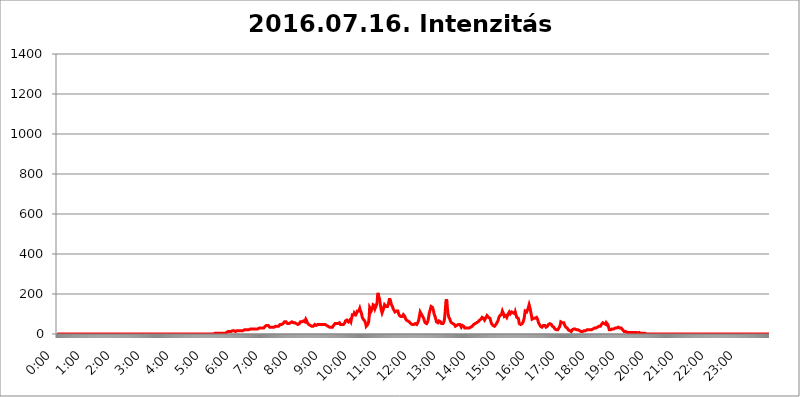
| Category | 2016.07.16. Intenzitás [W/m^2] |
|---|---|
| 0.0 | 0 |
| 0.0006944444444444445 | 0 |
| 0.001388888888888889 | 0 |
| 0.0020833333333333333 | 0 |
| 0.002777777777777778 | 0 |
| 0.003472222222222222 | 0 |
| 0.004166666666666667 | 0 |
| 0.004861111111111111 | 0 |
| 0.005555555555555556 | 0 |
| 0.0062499999999999995 | 0 |
| 0.006944444444444444 | 0 |
| 0.007638888888888889 | 0 |
| 0.008333333333333333 | 0 |
| 0.009027777777777779 | 0 |
| 0.009722222222222222 | 0 |
| 0.010416666666666666 | 0 |
| 0.011111111111111112 | 0 |
| 0.011805555555555555 | 0 |
| 0.012499999999999999 | 0 |
| 0.013194444444444444 | 0 |
| 0.013888888888888888 | 0 |
| 0.014583333333333332 | 0 |
| 0.015277777777777777 | 0 |
| 0.015972222222222224 | 0 |
| 0.016666666666666666 | 0 |
| 0.017361111111111112 | 0 |
| 0.018055555555555557 | 0 |
| 0.01875 | 0 |
| 0.019444444444444445 | 0 |
| 0.02013888888888889 | 0 |
| 0.020833333333333332 | 0 |
| 0.02152777777777778 | 0 |
| 0.022222222222222223 | 0 |
| 0.02291666666666667 | 0 |
| 0.02361111111111111 | 0 |
| 0.024305555555555556 | 0 |
| 0.024999999999999998 | 0 |
| 0.025694444444444447 | 0 |
| 0.02638888888888889 | 0 |
| 0.027083333333333334 | 0 |
| 0.027777777777777776 | 0 |
| 0.02847222222222222 | 0 |
| 0.029166666666666664 | 0 |
| 0.029861111111111113 | 0 |
| 0.030555555555555555 | 0 |
| 0.03125 | 0 |
| 0.03194444444444445 | 0 |
| 0.03263888888888889 | 0 |
| 0.03333333333333333 | 0 |
| 0.034027777777777775 | 0 |
| 0.034722222222222224 | 0 |
| 0.035416666666666666 | 0 |
| 0.036111111111111115 | 0 |
| 0.03680555555555556 | 0 |
| 0.0375 | 0 |
| 0.03819444444444444 | 0 |
| 0.03888888888888889 | 0 |
| 0.03958333333333333 | 0 |
| 0.04027777777777778 | 0 |
| 0.04097222222222222 | 0 |
| 0.041666666666666664 | 0 |
| 0.042361111111111106 | 0 |
| 0.04305555555555556 | 0 |
| 0.043750000000000004 | 0 |
| 0.044444444444444446 | 0 |
| 0.04513888888888889 | 0 |
| 0.04583333333333334 | 0 |
| 0.04652777777777778 | 0 |
| 0.04722222222222222 | 0 |
| 0.04791666666666666 | 0 |
| 0.04861111111111111 | 0 |
| 0.049305555555555554 | 0 |
| 0.049999999999999996 | 0 |
| 0.05069444444444445 | 0 |
| 0.051388888888888894 | 0 |
| 0.052083333333333336 | 0 |
| 0.05277777777777778 | 0 |
| 0.05347222222222222 | 0 |
| 0.05416666666666667 | 0 |
| 0.05486111111111111 | 0 |
| 0.05555555555555555 | 0 |
| 0.05625 | 0 |
| 0.05694444444444444 | 0 |
| 0.057638888888888885 | 0 |
| 0.05833333333333333 | 0 |
| 0.05902777777777778 | 0 |
| 0.059722222222222225 | 0 |
| 0.06041666666666667 | 0 |
| 0.061111111111111116 | 0 |
| 0.06180555555555556 | 0 |
| 0.0625 | 0 |
| 0.06319444444444444 | 0 |
| 0.06388888888888888 | 0 |
| 0.06458333333333334 | 0 |
| 0.06527777777777778 | 0 |
| 0.06597222222222222 | 0 |
| 0.06666666666666667 | 0 |
| 0.06736111111111111 | 0 |
| 0.06805555555555555 | 0 |
| 0.06874999999999999 | 0 |
| 0.06944444444444443 | 0 |
| 0.07013888888888889 | 0 |
| 0.07083333333333333 | 0 |
| 0.07152777777777779 | 0 |
| 0.07222222222222223 | 0 |
| 0.07291666666666667 | 0 |
| 0.07361111111111111 | 0 |
| 0.07430555555555556 | 0 |
| 0.075 | 0 |
| 0.07569444444444444 | 0 |
| 0.0763888888888889 | 0 |
| 0.07708333333333334 | 0 |
| 0.07777777777777778 | 0 |
| 0.07847222222222222 | 0 |
| 0.07916666666666666 | 0 |
| 0.0798611111111111 | 0 |
| 0.08055555555555556 | 0 |
| 0.08125 | 0 |
| 0.08194444444444444 | 0 |
| 0.08263888888888889 | 0 |
| 0.08333333333333333 | 0 |
| 0.08402777777777777 | 0 |
| 0.08472222222222221 | 0 |
| 0.08541666666666665 | 0 |
| 0.08611111111111112 | 0 |
| 0.08680555555555557 | 0 |
| 0.08750000000000001 | 0 |
| 0.08819444444444445 | 0 |
| 0.08888888888888889 | 0 |
| 0.08958333333333333 | 0 |
| 0.09027777777777778 | 0 |
| 0.09097222222222222 | 0 |
| 0.09166666666666667 | 0 |
| 0.09236111111111112 | 0 |
| 0.09305555555555556 | 0 |
| 0.09375 | 0 |
| 0.09444444444444444 | 0 |
| 0.09513888888888888 | 0 |
| 0.09583333333333333 | 0 |
| 0.09652777777777777 | 0 |
| 0.09722222222222222 | 0 |
| 0.09791666666666667 | 0 |
| 0.09861111111111111 | 0 |
| 0.09930555555555555 | 0 |
| 0.09999999999999999 | 0 |
| 0.10069444444444443 | 0 |
| 0.1013888888888889 | 0 |
| 0.10208333333333335 | 0 |
| 0.10277777777777779 | 0 |
| 0.10347222222222223 | 0 |
| 0.10416666666666667 | 0 |
| 0.10486111111111111 | 0 |
| 0.10555555555555556 | 0 |
| 0.10625 | 0 |
| 0.10694444444444444 | 0 |
| 0.1076388888888889 | 0 |
| 0.10833333333333334 | 0 |
| 0.10902777777777778 | 0 |
| 0.10972222222222222 | 0 |
| 0.1111111111111111 | 0 |
| 0.11180555555555556 | 0 |
| 0.11180555555555556 | 0 |
| 0.1125 | 0 |
| 0.11319444444444444 | 0 |
| 0.11388888888888889 | 0 |
| 0.11458333333333333 | 0 |
| 0.11527777777777777 | 0 |
| 0.11597222222222221 | 0 |
| 0.11666666666666665 | 0 |
| 0.1173611111111111 | 0 |
| 0.11805555555555557 | 0 |
| 0.11944444444444445 | 0 |
| 0.12013888888888889 | 0 |
| 0.12083333333333333 | 0 |
| 0.12152777777777778 | 0 |
| 0.12222222222222223 | 0 |
| 0.12291666666666667 | 0 |
| 0.12291666666666667 | 0 |
| 0.12361111111111112 | 0 |
| 0.12430555555555556 | 0 |
| 0.125 | 0 |
| 0.12569444444444444 | 0 |
| 0.12638888888888888 | 0 |
| 0.12708333333333333 | 0 |
| 0.16875 | 0 |
| 0.12847222222222224 | 0 |
| 0.12916666666666668 | 0 |
| 0.12986111111111112 | 0 |
| 0.13055555555555556 | 0 |
| 0.13125 | 0 |
| 0.13194444444444445 | 0 |
| 0.1326388888888889 | 0 |
| 0.13333333333333333 | 0 |
| 0.13402777777777777 | 0 |
| 0.13402777777777777 | 0 |
| 0.13472222222222222 | 0 |
| 0.13541666666666666 | 0 |
| 0.1361111111111111 | 0 |
| 0.13749999999999998 | 0 |
| 0.13819444444444443 | 0 |
| 0.1388888888888889 | 0 |
| 0.13958333333333334 | 0 |
| 0.14027777777777778 | 0 |
| 0.14097222222222222 | 0 |
| 0.14166666666666666 | 0 |
| 0.1423611111111111 | 0 |
| 0.14305555555555557 | 0 |
| 0.14375000000000002 | 0 |
| 0.14444444444444446 | 0 |
| 0.1451388888888889 | 0 |
| 0.1451388888888889 | 0 |
| 0.14652777777777778 | 0 |
| 0.14722222222222223 | 0 |
| 0.14791666666666667 | 0 |
| 0.1486111111111111 | 0 |
| 0.14930555555555555 | 0 |
| 0.15 | 0 |
| 0.15069444444444444 | 0 |
| 0.15138888888888888 | 0 |
| 0.15208333333333332 | 0 |
| 0.15277777777777776 | 0 |
| 0.15347222222222223 | 0 |
| 0.15416666666666667 | 0 |
| 0.15486111111111112 | 0 |
| 0.15555555555555556 | 0 |
| 0.15625 | 0 |
| 0.15694444444444444 | 0 |
| 0.15763888888888888 | 0 |
| 0.15833333333333333 | 0 |
| 0.15902777777777777 | 0 |
| 0.15972222222222224 | 0 |
| 0.16041666666666668 | 0 |
| 0.16111111111111112 | 0 |
| 0.16180555555555556 | 0 |
| 0.1625 | 0 |
| 0.16319444444444445 | 0 |
| 0.1638888888888889 | 0 |
| 0.16458333333333333 | 0 |
| 0.16527777777777777 | 0 |
| 0.16597222222222222 | 0 |
| 0.16666666666666666 | 0 |
| 0.1673611111111111 | 0 |
| 0.16805555555555554 | 0 |
| 0.16874999999999998 | 0 |
| 0.16944444444444443 | 0 |
| 0.17013888888888887 | 0 |
| 0.1708333333333333 | 0 |
| 0.17152777777777775 | 0 |
| 0.17222222222222225 | 0 |
| 0.1729166666666667 | 0 |
| 0.17361111111111113 | 0 |
| 0.17430555555555557 | 0 |
| 0.17500000000000002 | 0 |
| 0.17569444444444446 | 0 |
| 0.1763888888888889 | 0 |
| 0.17708333333333334 | 0 |
| 0.17777777777777778 | 0 |
| 0.17847222222222223 | 0 |
| 0.17916666666666667 | 0 |
| 0.1798611111111111 | 0 |
| 0.18055555555555555 | 0 |
| 0.18125 | 0 |
| 0.18194444444444444 | 0 |
| 0.1826388888888889 | 0 |
| 0.18333333333333335 | 0 |
| 0.1840277777777778 | 0 |
| 0.18472222222222223 | 0 |
| 0.18541666666666667 | 0 |
| 0.18611111111111112 | 0 |
| 0.18680555555555556 | 0 |
| 0.1875 | 0 |
| 0.18819444444444444 | 0 |
| 0.18888888888888888 | 0 |
| 0.18958333333333333 | 0 |
| 0.19027777777777777 | 0 |
| 0.1909722222222222 | 0 |
| 0.19166666666666665 | 0 |
| 0.19236111111111112 | 0 |
| 0.19305555555555554 | 0 |
| 0.19375 | 0 |
| 0.19444444444444445 | 0 |
| 0.1951388888888889 | 0 |
| 0.19583333333333333 | 0 |
| 0.19652777777777777 | 0 |
| 0.19722222222222222 | 0 |
| 0.19791666666666666 | 0 |
| 0.1986111111111111 | 0 |
| 0.19930555555555554 | 0 |
| 0.19999999999999998 | 0 |
| 0.20069444444444443 | 0 |
| 0.20138888888888887 | 0 |
| 0.2020833333333333 | 0 |
| 0.2027777777777778 | 0 |
| 0.2034722222222222 | 0 |
| 0.2041666666666667 | 0 |
| 0.20486111111111113 | 0 |
| 0.20555555555555557 | 0 |
| 0.20625000000000002 | 0 |
| 0.20694444444444446 | 0 |
| 0.2076388888888889 | 0 |
| 0.20833333333333334 | 0 |
| 0.20902777777777778 | 0 |
| 0.20972222222222223 | 0 |
| 0.21041666666666667 | 0 |
| 0.2111111111111111 | 0 |
| 0.21180555555555555 | 0 |
| 0.2125 | 0 |
| 0.21319444444444444 | 0 |
| 0.2138888888888889 | 0 |
| 0.21458333333333335 | 0 |
| 0.2152777777777778 | 0 |
| 0.21597222222222223 | 0 |
| 0.21666666666666667 | 0 |
| 0.21736111111111112 | 0 |
| 0.21805555555555556 | 0 |
| 0.21875 | 0 |
| 0.21944444444444444 | 3.525 |
| 0.22013888888888888 | 0 |
| 0.22083333333333333 | 3.525 |
| 0.22152777777777777 | 3.525 |
| 0.2222222222222222 | 3.525 |
| 0.22291666666666665 | 3.525 |
| 0.2236111111111111 | 3.525 |
| 0.22430555555555556 | 3.525 |
| 0.225 | 3.525 |
| 0.22569444444444445 | 3.525 |
| 0.2263888888888889 | 3.525 |
| 0.22708333333333333 | 3.525 |
| 0.22777777777777777 | 3.525 |
| 0.22847222222222222 | 3.525 |
| 0.22916666666666666 | 3.525 |
| 0.2298611111111111 | 3.525 |
| 0.23055555555555554 | 3.525 |
| 0.23124999999999998 | 3.525 |
| 0.23194444444444443 | 3.525 |
| 0.23263888888888887 | 3.525 |
| 0.2333333333333333 | 3.525 |
| 0.2340277777777778 | 3.525 |
| 0.2347222222222222 | 3.525 |
| 0.2354166666666667 | 3.525 |
| 0.23611111111111113 | 3.525 |
| 0.23680555555555557 | 7.887 |
| 0.23750000000000002 | 7.887 |
| 0.23819444444444446 | 7.887 |
| 0.2388888888888889 | 7.887 |
| 0.23958333333333334 | 12.257 |
| 0.24027777777777778 | 12.257 |
| 0.24097222222222223 | 12.257 |
| 0.24166666666666667 | 12.257 |
| 0.2423611111111111 | 12.257 |
| 0.24305555555555555 | 12.257 |
| 0.24375 | 12.257 |
| 0.24444444444444446 | 12.257 |
| 0.24513888888888888 | 12.257 |
| 0.24583333333333335 | 16.636 |
| 0.2465277777777778 | 16.636 |
| 0.24722222222222223 | 16.636 |
| 0.24791666666666667 | 16.636 |
| 0.24861111111111112 | 16.636 |
| 0.24930555555555556 | 16.636 |
| 0.25 | 12.257 |
| 0.25069444444444444 | 16.636 |
| 0.2513888888888889 | 12.257 |
| 0.2520833333333333 | 16.636 |
| 0.25277777777777777 | 12.257 |
| 0.2534722222222222 | 12.257 |
| 0.25416666666666665 | 16.636 |
| 0.2548611111111111 | 16.636 |
| 0.2555555555555556 | 16.636 |
| 0.25625000000000003 | 16.636 |
| 0.2569444444444445 | 16.636 |
| 0.2576388888888889 | 16.636 |
| 0.25833333333333336 | 16.636 |
| 0.2590277777777778 | 16.636 |
| 0.25972222222222224 | 16.636 |
| 0.2604166666666667 | 16.636 |
| 0.2611111111111111 | 21.024 |
| 0.26180555555555557 | 21.024 |
| 0.2625 | 21.024 |
| 0.26319444444444445 | 21.024 |
| 0.2638888888888889 | 21.024 |
| 0.26458333333333334 | 21.024 |
| 0.2652777777777778 | 21.024 |
| 0.2659722222222222 | 21.024 |
| 0.26666666666666666 | 21.024 |
| 0.2673611111111111 | 21.024 |
| 0.26805555555555555 | 21.024 |
| 0.26875 | 21.024 |
| 0.26944444444444443 | 25.419 |
| 0.2701388888888889 | 25.419 |
| 0.2708333333333333 | 25.419 |
| 0.27152777777777776 | 25.419 |
| 0.2722222222222222 | 25.419 |
| 0.27291666666666664 | 25.419 |
| 0.2736111111111111 | 25.419 |
| 0.2743055555555555 | 25.419 |
| 0.27499999999999997 | 25.419 |
| 0.27569444444444446 | 29.823 |
| 0.27638888888888885 | 29.823 |
| 0.27708333333333335 | 25.419 |
| 0.2777777777777778 | 29.823 |
| 0.27847222222222223 | 25.419 |
| 0.2791666666666667 | 25.419 |
| 0.2798611111111111 | 25.419 |
| 0.28055555555555556 | 25.419 |
| 0.28125 | 25.419 |
| 0.28194444444444444 | 29.823 |
| 0.2826388888888889 | 29.823 |
| 0.2833333333333333 | 29.823 |
| 0.28402777777777777 | 29.823 |
| 0.2847222222222222 | 29.823 |
| 0.28541666666666665 | 29.823 |
| 0.28611111111111115 | 29.823 |
| 0.28680555555555554 | 29.823 |
| 0.28750000000000003 | 29.823 |
| 0.2881944444444445 | 29.823 |
| 0.2888888888888889 | 29.823 |
| 0.28958333333333336 | 29.823 |
| 0.2902777777777778 | 29.823 |
| 0.29097222222222224 | 29.823 |
| 0.2916666666666667 | 38.653 |
| 0.2923611111111111 | 38.653 |
| 0.29305555555555557 | 43.079 |
| 0.29375 | 43.079 |
| 0.29444444444444445 | 43.079 |
| 0.2951388888888889 | 43.079 |
| 0.29583333333333334 | 43.079 |
| 0.2965277777777778 | 38.653 |
| 0.2972222222222222 | 38.653 |
| 0.29791666666666666 | 34.234 |
| 0.2986111111111111 | 29.823 |
| 0.29930555555555555 | 29.823 |
| 0.3 | 34.234 |
| 0.30069444444444443 | 34.234 |
| 0.3013888888888889 | 34.234 |
| 0.3020833333333333 | 34.234 |
| 0.30277777777777776 | 38.653 |
| 0.3034722222222222 | 38.653 |
| 0.30416666666666664 | 34.234 |
| 0.3048611111111111 | 34.234 |
| 0.3055555555555555 | 38.653 |
| 0.30624999999999997 | 38.653 |
| 0.3069444444444444 | 38.653 |
| 0.3076388888888889 | 38.653 |
| 0.30833333333333335 | 38.653 |
| 0.3090277777777778 | 38.653 |
| 0.30972222222222223 | 38.653 |
| 0.3104166666666667 | 38.653 |
| 0.3111111111111111 | 43.079 |
| 0.31180555555555556 | 43.079 |
| 0.3125 | 47.511 |
| 0.31319444444444444 | 47.511 |
| 0.3138888888888889 | 47.511 |
| 0.3145833333333333 | 47.511 |
| 0.31527777777777777 | 51.951 |
| 0.3159722222222222 | 51.951 |
| 0.31666666666666665 | 51.951 |
| 0.31736111111111115 | 51.951 |
| 0.31805555555555554 | 56.398 |
| 0.31875000000000003 | 60.85 |
| 0.3194444444444445 | 60.85 |
| 0.3201388888888889 | 60.85 |
| 0.32083333333333336 | 60.85 |
| 0.3215277777777778 | 56.398 |
| 0.32222222222222224 | 56.398 |
| 0.3229166666666667 | 51.951 |
| 0.3236111111111111 | 51.951 |
| 0.32430555555555557 | 51.951 |
| 0.325 | 51.951 |
| 0.32569444444444445 | 51.951 |
| 0.3263888888888889 | 56.398 |
| 0.32708333333333334 | 56.398 |
| 0.3277777777777778 | 56.398 |
| 0.3284722222222222 | 56.398 |
| 0.32916666666666666 | 60.85 |
| 0.3298611111111111 | 56.398 |
| 0.33055555555555555 | 60.85 |
| 0.33125 | 56.398 |
| 0.33194444444444443 | 56.398 |
| 0.3326388888888889 | 56.398 |
| 0.3333333333333333 | 56.398 |
| 0.3340277777777778 | 56.398 |
| 0.3347222222222222 | 56.398 |
| 0.3354166666666667 | 51.951 |
| 0.3361111111111111 | 51.951 |
| 0.3368055555555556 | 47.511 |
| 0.33749999999999997 | 47.511 |
| 0.33819444444444446 | 47.511 |
| 0.33888888888888885 | 51.951 |
| 0.33958333333333335 | 51.951 |
| 0.34027777777777773 | 56.398 |
| 0.34097222222222223 | 60.85 |
| 0.3416666666666666 | 56.398 |
| 0.3423611111111111 | 56.398 |
| 0.3430555555555555 | 60.85 |
| 0.34375 | 65.31 |
| 0.3444444444444445 | 65.31 |
| 0.3451388888888889 | 65.31 |
| 0.3458333333333334 | 65.31 |
| 0.34652777777777777 | 65.31 |
| 0.34722222222222227 | 60.85 |
| 0.34791666666666665 | 65.31 |
| 0.34861111111111115 | 74.246 |
| 0.34930555555555554 | 74.246 |
| 0.35000000000000003 | 65.31 |
| 0.3506944444444444 | 56.398 |
| 0.3513888888888889 | 51.951 |
| 0.3520833333333333 | 51.951 |
| 0.3527777777777778 | 47.511 |
| 0.3534722222222222 | 43.079 |
| 0.3541666666666667 | 43.079 |
| 0.3548611111111111 | 43.079 |
| 0.35555555555555557 | 38.653 |
| 0.35625 | 38.653 |
| 0.35694444444444445 | 38.653 |
| 0.3576388888888889 | 38.653 |
| 0.35833333333333334 | 38.653 |
| 0.3590277777777778 | 38.653 |
| 0.3597222222222222 | 38.653 |
| 0.36041666666666666 | 43.079 |
| 0.3611111111111111 | 47.511 |
| 0.36180555555555555 | 47.511 |
| 0.3625 | 43.079 |
| 0.36319444444444443 | 43.079 |
| 0.3638888888888889 | 43.079 |
| 0.3645833333333333 | 43.079 |
| 0.3652777777777778 | 47.511 |
| 0.3659722222222222 | 47.511 |
| 0.3666666666666667 | 47.511 |
| 0.3673611111111111 | 47.511 |
| 0.3680555555555556 | 47.511 |
| 0.36874999999999997 | 43.079 |
| 0.36944444444444446 | 47.511 |
| 0.37013888888888885 | 47.511 |
| 0.37083333333333335 | 47.511 |
| 0.37152777777777773 | 47.511 |
| 0.37222222222222223 | 51.951 |
| 0.3729166666666666 | 47.511 |
| 0.3736111111111111 | 47.511 |
| 0.3743055555555555 | 47.511 |
| 0.375 | 47.511 |
| 0.3756944444444445 | 47.511 |
| 0.3763888888888889 | 43.079 |
| 0.3770833333333334 | 43.079 |
| 0.37777777777777777 | 43.079 |
| 0.37847222222222227 | 43.079 |
| 0.37916666666666665 | 38.653 |
| 0.37986111111111115 | 38.653 |
| 0.38055555555555554 | 38.653 |
| 0.38125000000000003 | 38.653 |
| 0.3819444444444444 | 34.234 |
| 0.3826388888888889 | 29.823 |
| 0.3833333333333333 | 29.823 |
| 0.3840277777777778 | 34.234 |
| 0.3847222222222222 | 38.653 |
| 0.3854166666666667 | 34.234 |
| 0.3861111111111111 | 34.234 |
| 0.38680555555555557 | 38.653 |
| 0.3875 | 43.079 |
| 0.38819444444444445 | 47.511 |
| 0.3888888888888889 | 47.511 |
| 0.38958333333333334 | 51.951 |
| 0.3902777777777778 | 56.398 |
| 0.3909722222222222 | 56.398 |
| 0.39166666666666666 | 51.951 |
| 0.3923611111111111 | 51.951 |
| 0.39305555555555555 | 51.951 |
| 0.39375 | 51.951 |
| 0.39444444444444443 | 51.951 |
| 0.3951388888888889 | 56.398 |
| 0.3958333333333333 | 56.398 |
| 0.3965277777777778 | 51.951 |
| 0.3972222222222222 | 47.511 |
| 0.3979166666666667 | 51.951 |
| 0.3986111111111111 | 51.951 |
| 0.3993055555555556 | 47.511 |
| 0.39999999999999997 | 47.511 |
| 0.40069444444444446 | 47.511 |
| 0.40138888888888885 | 47.511 |
| 0.40208333333333335 | 47.511 |
| 0.40277777777777773 | 51.951 |
| 0.40347222222222223 | 56.398 |
| 0.4041666666666666 | 65.31 |
| 0.4048611111111111 | 69.775 |
| 0.4055555555555555 | 65.31 |
| 0.40625 | 69.775 |
| 0.4069444444444445 | 65.31 |
| 0.4076388888888889 | 65.31 |
| 0.4083333333333334 | 60.85 |
| 0.40902777777777777 | 65.31 |
| 0.40972222222222227 | 65.31 |
| 0.41041666666666665 | 69.775 |
| 0.41111111111111115 | 65.31 |
| 0.41180555555555554 | 60.85 |
| 0.41250000000000003 | 74.246 |
| 0.4131944444444444 | 83.205 |
| 0.4138888888888889 | 96.682 |
| 0.4145833333333333 | 101.184 |
| 0.4152777777777778 | 96.682 |
| 0.4159722222222222 | 96.682 |
| 0.4166666666666667 | 105.69 |
| 0.4173611111111111 | 110.201 |
| 0.41805555555555557 | 101.184 |
| 0.41875 | 96.682 |
| 0.41944444444444445 | 101.184 |
| 0.4201388888888889 | 105.69 |
| 0.42083333333333334 | 114.716 |
| 0.4215277777777778 | 110.201 |
| 0.4222222222222222 | 110.201 |
| 0.42291666666666666 | 114.716 |
| 0.4236111111111111 | 119.235 |
| 0.42430555555555555 | 128.284 |
| 0.425 | 119.235 |
| 0.42569444444444443 | 114.716 |
| 0.4263888888888889 | 105.69 |
| 0.4270833333333333 | 96.682 |
| 0.4277777777777778 | 83.205 |
| 0.4284722222222222 | 83.205 |
| 0.4291666666666667 | 74.246 |
| 0.4298611111111111 | 74.246 |
| 0.4305555555555556 | 74.246 |
| 0.43124999999999997 | 65.31 |
| 0.43194444444444446 | 60.85 |
| 0.43263888888888885 | 51.951 |
| 0.43333333333333335 | 38.653 |
| 0.43402777777777773 | 38.653 |
| 0.43472222222222223 | 38.653 |
| 0.4354166666666666 | 47.511 |
| 0.4361111111111111 | 51.951 |
| 0.4368055555555555 | 60.85 |
| 0.4375 | 87.692 |
| 0.4381944444444445 | 132.814 |
| 0.4388888888888889 | 137.347 |
| 0.4395833333333334 | 123.758 |
| 0.44027777777777777 | 114.716 |
| 0.44097222222222227 | 114.716 |
| 0.44166666666666665 | 123.758 |
| 0.44236111111111115 | 132.814 |
| 0.44305555555555554 | 146.423 |
| 0.44375000000000003 | 150.964 |
| 0.4444444444444444 | 146.423 |
| 0.4451388888888889 | 141.884 |
| 0.4458333333333333 | 128.284 |
| 0.4465277777777778 | 123.758 |
| 0.4472222222222222 | 132.814 |
| 0.4479166666666667 | 146.423 |
| 0.4486111111111111 | 160.056 |
| 0.44930555555555557 | 191.937 |
| 0.45 | 205.62 |
| 0.45069444444444445 | 191.937 |
| 0.4513888888888889 | 187.378 |
| 0.45208333333333334 | 173.709 |
| 0.4527777777777778 | 155.509 |
| 0.4534722222222222 | 141.884 |
| 0.45416666666666666 | 123.758 |
| 0.4548611111111111 | 114.716 |
| 0.45555555555555555 | 105.69 |
| 0.45625 | 110.201 |
| 0.45694444444444443 | 119.235 |
| 0.4576388888888889 | 123.758 |
| 0.4583333333333333 | 137.347 |
| 0.4590277777777778 | 146.423 |
| 0.4597222222222222 | 146.423 |
| 0.4604166666666667 | 141.884 |
| 0.4611111111111111 | 137.347 |
| 0.4618055555555556 | 137.347 |
| 0.46249999999999997 | 137.347 |
| 0.46319444444444446 | 137.347 |
| 0.46388888888888885 | 141.884 |
| 0.46458333333333335 | 150.964 |
| 0.46527777777777773 | 164.605 |
| 0.46597222222222223 | 178.264 |
| 0.4666666666666666 | 182.82 |
| 0.4673611111111111 | 173.709 |
| 0.4680555555555555 | 155.509 |
| 0.46875 | 146.423 |
| 0.4694444444444445 | 141.884 |
| 0.4701388888888889 | 137.347 |
| 0.4708333333333334 | 128.284 |
| 0.47152777777777777 | 123.758 |
| 0.47222222222222227 | 119.235 |
| 0.47291666666666665 | 114.716 |
| 0.47361111111111115 | 110.201 |
| 0.47430555555555554 | 110.201 |
| 0.47500000000000003 | 114.716 |
| 0.4756944444444444 | 114.716 |
| 0.4763888888888889 | 114.716 |
| 0.4770833333333333 | 114.716 |
| 0.4777777777777778 | 114.716 |
| 0.4784722222222222 | 105.69 |
| 0.4791666666666667 | 101.184 |
| 0.4798611111111111 | 92.184 |
| 0.48055555555555557 | 92.184 |
| 0.48125 | 92.184 |
| 0.48194444444444445 | 87.692 |
| 0.4826388888888889 | 83.205 |
| 0.48333333333333334 | 83.205 |
| 0.4840277777777778 | 87.692 |
| 0.4847222222222222 | 92.184 |
| 0.48541666666666666 | 96.682 |
| 0.4861111111111111 | 96.682 |
| 0.48680555555555555 | 92.184 |
| 0.4875 | 87.692 |
| 0.48819444444444443 | 78.722 |
| 0.4888888888888889 | 74.246 |
| 0.4895833333333333 | 69.775 |
| 0.4902777777777778 | 74.246 |
| 0.4909722222222222 | 65.31 |
| 0.4916666666666667 | 65.31 |
| 0.4923611111111111 | 60.85 |
| 0.4930555555555556 | 65.31 |
| 0.49374999999999997 | 60.85 |
| 0.49444444444444446 | 60.85 |
| 0.49513888888888885 | 56.398 |
| 0.49583333333333335 | 51.951 |
| 0.49652777777777773 | 47.511 |
| 0.49722222222222223 | 47.511 |
| 0.4979166666666666 | 47.511 |
| 0.4986111111111111 | 47.511 |
| 0.4993055555555555 | 43.079 |
| 0.5 | 47.511 |
| 0.5006944444444444 | 47.511 |
| 0.5013888888888889 | 51.951 |
| 0.5020833333333333 | 51.951 |
| 0.5027777777777778 | 51.951 |
| 0.5034722222222222 | 47.511 |
| 0.5041666666666667 | 47.511 |
| 0.5048611111111111 | 51.951 |
| 0.5055555555555555 | 56.398 |
| 0.50625 | 60.85 |
| 0.5069444444444444 | 69.775 |
| 0.5076388888888889 | 83.205 |
| 0.5083333333333333 | 96.682 |
| 0.5090277777777777 | 110.201 |
| 0.5097222222222222 | 110.201 |
| 0.5104166666666666 | 101.184 |
| 0.5111111111111112 | 101.184 |
| 0.5118055555555555 | 96.682 |
| 0.5125000000000001 | 87.692 |
| 0.5131944444444444 | 83.205 |
| 0.513888888888889 | 78.722 |
| 0.5145833333333333 | 69.775 |
| 0.5152777777777778 | 65.31 |
| 0.5159722222222222 | 56.398 |
| 0.5166666666666667 | 51.951 |
| 0.517361111111111 | 51.951 |
| 0.5180555555555556 | 51.951 |
| 0.5187499999999999 | 56.398 |
| 0.5194444444444445 | 60.85 |
| 0.5201388888888888 | 69.775 |
| 0.5208333333333334 | 83.205 |
| 0.5215277777777778 | 101.184 |
| 0.5222222222222223 | 110.201 |
| 0.5229166666666667 | 119.235 |
| 0.5236111111111111 | 128.284 |
| 0.5243055555555556 | 137.347 |
| 0.525 | 137.347 |
| 0.5256944444444445 | 137.347 |
| 0.5263888888888889 | 132.814 |
| 0.5270833333333333 | 123.758 |
| 0.5277777777777778 | 114.716 |
| 0.5284722222222222 | 101.184 |
| 0.5291666666666667 | 96.682 |
| 0.5298611111111111 | 87.692 |
| 0.5305555555555556 | 78.722 |
| 0.53125 | 69.775 |
| 0.5319444444444444 | 60.85 |
| 0.5326388888888889 | 56.398 |
| 0.5333333333333333 | 56.398 |
| 0.5340277777777778 | 56.398 |
| 0.5347222222222222 | 60.85 |
| 0.5354166666666667 | 65.31 |
| 0.5361111111111111 | 65.31 |
| 0.5368055555555555 | 60.85 |
| 0.5375 | 60.85 |
| 0.5381944444444444 | 56.398 |
| 0.5388888888888889 | 51.951 |
| 0.5395833333333333 | 51.951 |
| 0.5402777777777777 | 51.951 |
| 0.5409722222222222 | 51.951 |
| 0.5416666666666666 | 56.398 |
| 0.5423611111111112 | 60.85 |
| 0.5430555555555555 | 74.246 |
| 0.5437500000000001 | 96.682 |
| 0.5444444444444444 | 128.284 |
| 0.545138888888889 | 164.605 |
| 0.5458333333333333 | 173.709 |
| 0.5465277777777778 | 160.056 |
| 0.5472222222222222 | 128.284 |
| 0.5479166666666667 | 105.69 |
| 0.548611111111111 | 92.184 |
| 0.5493055555555556 | 83.205 |
| 0.5499999999999999 | 78.722 |
| 0.5506944444444445 | 74.246 |
| 0.5513888888888888 | 65.31 |
| 0.5520833333333334 | 60.85 |
| 0.5527777777777778 | 56.398 |
| 0.5534722222222223 | 51.951 |
| 0.5541666666666667 | 51.951 |
| 0.5548611111111111 | 51.951 |
| 0.5555555555555556 | 51.951 |
| 0.55625 | 51.951 |
| 0.5569444444444445 | 47.511 |
| 0.5576388888888889 | 43.079 |
| 0.5583333333333333 | 38.653 |
| 0.5590277777777778 | 38.653 |
| 0.5597222222222222 | 43.079 |
| 0.5604166666666667 | 43.079 |
| 0.5611111111111111 | 38.653 |
| 0.5618055555555556 | 47.511 |
| 0.5625 | 47.511 |
| 0.5631944444444444 | 51.951 |
| 0.5638888888888889 | 47.511 |
| 0.5645833333333333 | 47.511 |
| 0.5652777777777778 | 47.511 |
| 0.5659722222222222 | 43.079 |
| 0.5666666666666667 | 34.234 |
| 0.5673611111111111 | 38.653 |
| 0.5680555555555555 | 43.079 |
| 0.56875 | 38.653 |
| 0.5694444444444444 | 38.653 |
| 0.5701388888888889 | 38.653 |
| 0.5708333333333333 | 34.234 |
| 0.5715277777777777 | 29.823 |
| 0.5722222222222222 | 29.823 |
| 0.5729166666666666 | 29.823 |
| 0.5736111111111112 | 29.823 |
| 0.5743055555555555 | 25.419 |
| 0.5750000000000001 | 25.419 |
| 0.5756944444444444 | 29.823 |
| 0.576388888888889 | 29.823 |
| 0.5770833333333333 | 29.823 |
| 0.5777777777777778 | 29.823 |
| 0.5784722222222222 | 29.823 |
| 0.5791666666666667 | 34.234 |
| 0.579861111111111 | 34.234 |
| 0.5805555555555556 | 38.653 |
| 0.5812499999999999 | 38.653 |
| 0.5819444444444445 | 38.653 |
| 0.5826388888888888 | 38.653 |
| 0.5833333333333334 | 43.079 |
| 0.5840277777777778 | 47.511 |
| 0.5847222222222223 | 51.951 |
| 0.5854166666666667 | 51.951 |
| 0.5861111111111111 | 51.951 |
| 0.5868055555555556 | 51.951 |
| 0.5875 | 56.398 |
| 0.5881944444444445 | 56.398 |
| 0.5888888888888889 | 56.398 |
| 0.5895833333333333 | 56.398 |
| 0.5902777777777778 | 60.85 |
| 0.5909722222222222 | 65.31 |
| 0.5916666666666667 | 65.31 |
| 0.5923611111111111 | 69.775 |
| 0.5930555555555556 | 74.246 |
| 0.59375 | 74.246 |
| 0.5944444444444444 | 74.246 |
| 0.5951388888888889 | 78.722 |
| 0.5958333333333333 | 83.205 |
| 0.5965277777777778 | 87.692 |
| 0.5972222222222222 | 83.205 |
| 0.5979166666666667 | 78.722 |
| 0.5986111111111111 | 74.246 |
| 0.5993055555555555 | 69.775 |
| 0.6 | 69.775 |
| 0.6006944444444444 | 74.246 |
| 0.6013888888888889 | 83.205 |
| 0.6020833333333333 | 83.205 |
| 0.6027777777777777 | 92.184 |
| 0.6034722222222222 | 96.682 |
| 0.6041666666666666 | 96.682 |
| 0.6048611111111112 | 83.205 |
| 0.6055555555555555 | 83.205 |
| 0.6062500000000001 | 78.722 |
| 0.6069444444444444 | 78.722 |
| 0.607638888888889 | 69.775 |
| 0.6083333333333333 | 60.85 |
| 0.6090277777777778 | 51.951 |
| 0.6097222222222222 | 47.511 |
| 0.6104166666666667 | 47.511 |
| 0.611111111111111 | 43.079 |
| 0.6118055555555556 | 43.079 |
| 0.6124999999999999 | 43.079 |
| 0.6131944444444445 | 38.653 |
| 0.6138888888888888 | 38.653 |
| 0.6145833333333334 | 43.079 |
| 0.6152777777777778 | 47.511 |
| 0.6159722222222223 | 51.951 |
| 0.6166666666666667 | 56.398 |
| 0.6173611111111111 | 60.85 |
| 0.6180555555555556 | 65.31 |
| 0.61875 | 74.246 |
| 0.6194444444444445 | 83.205 |
| 0.6201388888888889 | 87.692 |
| 0.6208333333333333 | 92.184 |
| 0.6215277777777778 | 92.184 |
| 0.6222222222222222 | 92.184 |
| 0.6229166666666667 | 96.682 |
| 0.6236111111111111 | 105.69 |
| 0.6243055555555556 | 114.716 |
| 0.625 | 119.235 |
| 0.6256944444444444 | 110.201 |
| 0.6263888888888889 | 96.682 |
| 0.6270833333333333 | 87.692 |
| 0.6277777777777778 | 87.692 |
| 0.6284722222222222 | 92.184 |
| 0.6291666666666667 | 92.184 |
| 0.6298611111111111 | 87.692 |
| 0.6305555555555555 | 83.205 |
| 0.63125 | 83.205 |
| 0.6319444444444444 | 87.692 |
| 0.6326388888888889 | 101.184 |
| 0.6333333333333333 | 105.69 |
| 0.6340277777777777 | 110.201 |
| 0.6347222222222222 | 105.69 |
| 0.6354166666666666 | 101.184 |
| 0.6361111111111112 | 101.184 |
| 0.6368055555555555 | 101.184 |
| 0.6375000000000001 | 110.201 |
| 0.6381944444444444 | 110.201 |
| 0.638888888888889 | 110.201 |
| 0.6395833333333333 | 105.69 |
| 0.6402777777777778 | 101.184 |
| 0.6409722222222222 | 101.184 |
| 0.6416666666666667 | 101.184 |
| 0.642361111111111 | 110.201 |
| 0.6430555555555556 | 105.69 |
| 0.6437499999999999 | 92.184 |
| 0.6444444444444445 | 83.205 |
| 0.6451388888888888 | 78.722 |
| 0.6458333333333334 | 78.722 |
| 0.6465277777777778 | 78.722 |
| 0.6472222222222223 | 69.775 |
| 0.6479166666666667 | 51.951 |
| 0.6486111111111111 | 47.511 |
| 0.6493055555555556 | 47.511 |
| 0.65 | 47.511 |
| 0.6506944444444445 | 47.511 |
| 0.6513888888888889 | 47.511 |
| 0.6520833333333333 | 51.951 |
| 0.6527777777777778 | 56.398 |
| 0.6534722222222222 | 60.85 |
| 0.6541666666666667 | 69.775 |
| 0.6548611111111111 | 78.722 |
| 0.6555555555555556 | 96.682 |
| 0.65625 | 114.716 |
| 0.6569444444444444 | 119.235 |
| 0.6576388888888889 | 114.716 |
| 0.6583333333333333 | 110.201 |
| 0.6590277777777778 | 110.201 |
| 0.6597222222222222 | 114.716 |
| 0.6604166666666667 | 128.284 |
| 0.6611111111111111 | 137.347 |
| 0.6618055555555555 | 146.423 |
| 0.6625 | 137.347 |
| 0.6631944444444444 | 128.284 |
| 0.6638888888888889 | 114.716 |
| 0.6645833333333333 | 101.184 |
| 0.6652777777777777 | 87.692 |
| 0.6659722222222222 | 74.246 |
| 0.6666666666666666 | 74.246 |
| 0.6673611111111111 | 78.722 |
| 0.6680555555555556 | 78.722 |
| 0.6687500000000001 | 83.205 |
| 0.6694444444444444 | 78.722 |
| 0.6701388888888888 | 78.722 |
| 0.6708333333333334 | 83.205 |
| 0.6715277777777778 | 83.205 |
| 0.6722222222222222 | 83.205 |
| 0.6729166666666666 | 78.722 |
| 0.6736111111111112 | 74.246 |
| 0.6743055555555556 | 65.31 |
| 0.6749999999999999 | 56.398 |
| 0.6756944444444444 | 51.951 |
| 0.6763888888888889 | 47.511 |
| 0.6770833333333334 | 43.079 |
| 0.6777777777777777 | 38.653 |
| 0.6784722222222223 | 38.653 |
| 0.6791666666666667 | 34.234 |
| 0.6798611111111111 | 34.234 |
| 0.6805555555555555 | 38.653 |
| 0.68125 | 38.653 |
| 0.6819444444444445 | 43.079 |
| 0.6826388888888889 | 43.079 |
| 0.6833333333333332 | 43.079 |
| 0.6840277777777778 | 43.079 |
| 0.6847222222222222 | 38.653 |
| 0.6854166666666667 | 34.234 |
| 0.686111111111111 | 34.234 |
| 0.6868055555555556 | 38.653 |
| 0.6875 | 38.653 |
| 0.6881944444444444 | 43.079 |
| 0.688888888888889 | 47.511 |
| 0.6895833333333333 | 47.511 |
| 0.6902777777777778 | 47.511 |
| 0.6909722222222222 | 51.951 |
| 0.6916666666666668 | 51.951 |
| 0.6923611111111111 | 51.951 |
| 0.6930555555555555 | 47.511 |
| 0.69375 | 47.511 |
| 0.6944444444444445 | 38.653 |
| 0.6951388888888889 | 38.653 |
| 0.6958333333333333 | 38.653 |
| 0.6965277777777777 | 34.234 |
| 0.6972222222222223 | 29.823 |
| 0.6979166666666666 | 25.419 |
| 0.6986111111111111 | 25.419 |
| 0.6993055555555556 | 21.024 |
| 0.7000000000000001 | 21.024 |
| 0.7006944444444444 | 21.024 |
| 0.7013888888888888 | 21.024 |
| 0.7020833333333334 | 21.024 |
| 0.7027777777777778 | 25.419 |
| 0.7034722222222222 | 29.823 |
| 0.7041666666666666 | 29.823 |
| 0.7048611111111112 | 38.653 |
| 0.7055555555555556 | 47.511 |
| 0.7062499999999999 | 60.85 |
| 0.7069444444444444 | 60.85 |
| 0.7076388888888889 | 60.85 |
| 0.7083333333333334 | 56.398 |
| 0.7090277777777777 | 56.398 |
| 0.7097222222222223 | 60.85 |
| 0.7104166666666667 | 56.398 |
| 0.7111111111111111 | 51.951 |
| 0.7118055555555555 | 43.079 |
| 0.7125 | 38.653 |
| 0.7131944444444445 | 34.234 |
| 0.7138888888888889 | 34.234 |
| 0.7145833333333332 | 29.823 |
| 0.7152777777777778 | 29.823 |
| 0.7159722222222222 | 25.419 |
| 0.7166666666666667 | 21.024 |
| 0.717361111111111 | 21.024 |
| 0.7180555555555556 | 16.636 |
| 0.71875 | 16.636 |
| 0.7194444444444444 | 16.636 |
| 0.720138888888889 | 12.257 |
| 0.7208333333333333 | 12.257 |
| 0.7215277777777778 | 16.636 |
| 0.7222222222222222 | 21.024 |
| 0.7229166666666668 | 25.419 |
| 0.7236111111111111 | 25.419 |
| 0.7243055555555555 | 25.419 |
| 0.725 | 25.419 |
| 0.7256944444444445 | 25.419 |
| 0.7263888888888889 | 25.419 |
| 0.7270833333333333 | 25.419 |
| 0.7277777777777777 | 25.419 |
| 0.7284722222222223 | 21.024 |
| 0.7291666666666666 | 21.024 |
| 0.7298611111111111 | 21.024 |
| 0.7305555555555556 | 21.024 |
| 0.7312500000000001 | 16.636 |
| 0.7319444444444444 | 16.636 |
| 0.7326388888888888 | 16.636 |
| 0.7333333333333334 | 16.636 |
| 0.7340277777777778 | 16.636 |
| 0.7347222222222222 | 12.257 |
| 0.7354166666666666 | 12.257 |
| 0.7361111111111112 | 12.257 |
| 0.7368055555555556 | 12.257 |
| 0.7374999999999999 | 12.257 |
| 0.7381944444444444 | 12.257 |
| 0.7388888888888889 | 16.636 |
| 0.7395833333333334 | 16.636 |
| 0.7402777777777777 | 16.636 |
| 0.7409722222222223 | 16.636 |
| 0.7416666666666667 | 21.024 |
| 0.7423611111111111 | 21.024 |
| 0.7430555555555555 | 21.024 |
| 0.74375 | 21.024 |
| 0.7444444444444445 | 21.024 |
| 0.7451388888888889 | 21.024 |
| 0.7458333333333332 | 21.024 |
| 0.7465277777777778 | 21.024 |
| 0.7472222222222222 | 21.024 |
| 0.7479166666666667 | 21.024 |
| 0.748611111111111 | 21.024 |
| 0.7493055555555556 | 21.024 |
| 0.75 | 25.419 |
| 0.7506944444444444 | 25.419 |
| 0.751388888888889 | 25.419 |
| 0.7520833333333333 | 25.419 |
| 0.7527777777777778 | 25.419 |
| 0.7534722222222222 | 29.823 |
| 0.7541666666666668 | 29.823 |
| 0.7548611111111111 | 29.823 |
| 0.7555555555555555 | 29.823 |
| 0.75625 | 34.234 |
| 0.7569444444444445 | 34.234 |
| 0.7576388888888889 | 34.234 |
| 0.7583333333333333 | 34.234 |
| 0.7590277777777777 | 38.653 |
| 0.7597222222222223 | 38.653 |
| 0.7604166666666666 | 38.653 |
| 0.7611111111111111 | 38.653 |
| 0.7618055555555556 | 38.653 |
| 0.7625000000000001 | 43.079 |
| 0.7631944444444444 | 47.511 |
| 0.7638888888888888 | 47.511 |
| 0.7645833333333334 | 51.951 |
| 0.7652777777777778 | 56.398 |
| 0.7659722222222222 | 56.398 |
| 0.7666666666666666 | 56.398 |
| 0.7673611111111112 | 51.951 |
| 0.7680555555555556 | 47.511 |
| 0.7687499999999999 | 47.511 |
| 0.7694444444444444 | 47.511 |
| 0.7701388888888889 | 56.398 |
| 0.7708333333333334 | 56.398 |
| 0.7715277777777777 | 56.398 |
| 0.7722222222222223 | 47.511 |
| 0.7729166666666667 | 38.653 |
| 0.7736111111111111 | 29.823 |
| 0.7743055555555555 | 21.024 |
| 0.775 | 21.024 |
| 0.7756944444444445 | 21.024 |
| 0.7763888888888889 | 21.024 |
| 0.7770833333333332 | 21.024 |
| 0.7777777777777778 | 25.419 |
| 0.7784722222222222 | 25.419 |
| 0.7791666666666667 | 25.419 |
| 0.779861111111111 | 25.419 |
| 0.7805555555555556 | 25.419 |
| 0.78125 | 25.419 |
| 0.7819444444444444 | 29.823 |
| 0.782638888888889 | 29.823 |
| 0.7833333333333333 | 34.234 |
| 0.7840277777777778 | 29.823 |
| 0.7847222222222222 | 29.823 |
| 0.7854166666666668 | 29.823 |
| 0.7861111111111111 | 29.823 |
| 0.7868055555555555 | 34.234 |
| 0.7875 | 34.234 |
| 0.7881944444444445 | 29.823 |
| 0.7888888888888889 | 29.823 |
| 0.7895833333333333 | 29.823 |
| 0.7902777777777777 | 29.823 |
| 0.7909722222222223 | 29.823 |
| 0.7916666666666666 | 25.419 |
| 0.7923611111111111 | 25.419 |
| 0.7930555555555556 | 21.024 |
| 0.7937500000000001 | 21.024 |
| 0.7944444444444444 | 16.636 |
| 0.7951388888888888 | 12.257 |
| 0.7958333333333334 | 12.257 |
| 0.7965277777777778 | 12.257 |
| 0.7972222222222222 | 12.257 |
| 0.7979166666666666 | 7.887 |
| 0.7986111111111112 | 7.887 |
| 0.7993055555555556 | 7.887 |
| 0.7999999999999999 | 7.887 |
| 0.8006944444444444 | 7.887 |
| 0.8013888888888889 | 7.887 |
| 0.8020833333333334 | 7.887 |
| 0.8027777777777777 | 7.887 |
| 0.8034722222222223 | 7.887 |
| 0.8041666666666667 | 7.887 |
| 0.8048611111111111 | 7.887 |
| 0.8055555555555555 | 7.887 |
| 0.80625 | 7.887 |
| 0.8069444444444445 | 7.887 |
| 0.8076388888888889 | 7.887 |
| 0.8083333333333332 | 7.887 |
| 0.8090277777777778 | 7.887 |
| 0.8097222222222222 | 7.887 |
| 0.8104166666666667 | 7.887 |
| 0.811111111111111 | 3.525 |
| 0.8118055555555556 | 7.887 |
| 0.8125 | 3.525 |
| 0.8131944444444444 | 3.525 |
| 0.813888888888889 | 3.525 |
| 0.8145833333333333 | 7.887 |
| 0.8152777777777778 | 7.887 |
| 0.8159722222222222 | 7.887 |
| 0.8166666666666668 | 3.525 |
| 0.8173611111111111 | 7.887 |
| 0.8180555555555555 | 3.525 |
| 0.81875 | 3.525 |
| 0.8194444444444445 | 3.525 |
| 0.8201388888888889 | 3.525 |
| 0.8208333333333333 | 3.525 |
| 0.8215277777777777 | 3.525 |
| 0.8222222222222223 | 3.525 |
| 0.8229166666666666 | 3.525 |
| 0.8236111111111111 | 3.525 |
| 0.8243055555555556 | 3.525 |
| 0.8250000000000001 | 0 |
| 0.8256944444444444 | 0 |
| 0.8263888888888888 | 0 |
| 0.8270833333333334 | 0 |
| 0.8277777777777778 | 0 |
| 0.8284722222222222 | 0 |
| 0.8291666666666666 | 0 |
| 0.8298611111111112 | 0 |
| 0.8305555555555556 | 0 |
| 0.8312499999999999 | 0 |
| 0.8319444444444444 | 0 |
| 0.8326388888888889 | 0 |
| 0.8333333333333334 | 0 |
| 0.8340277777777777 | 0 |
| 0.8347222222222223 | 0 |
| 0.8354166666666667 | 0 |
| 0.8361111111111111 | 0 |
| 0.8368055555555555 | 0 |
| 0.8375 | 0 |
| 0.8381944444444445 | 0 |
| 0.8388888888888889 | 0 |
| 0.8395833333333332 | 0 |
| 0.8402777777777778 | 0 |
| 0.8409722222222222 | 0 |
| 0.8416666666666667 | 0 |
| 0.842361111111111 | 0 |
| 0.8430555555555556 | 0 |
| 0.84375 | 0 |
| 0.8444444444444444 | 0 |
| 0.845138888888889 | 0 |
| 0.8458333333333333 | 0 |
| 0.8465277777777778 | 0 |
| 0.8472222222222222 | 0 |
| 0.8479166666666668 | 0 |
| 0.8486111111111111 | 0 |
| 0.8493055555555555 | 0 |
| 0.85 | 0 |
| 0.8506944444444445 | 0 |
| 0.8513888888888889 | 0 |
| 0.8520833333333333 | 0 |
| 0.8527777777777777 | 0 |
| 0.8534722222222223 | 0 |
| 0.8541666666666666 | 0 |
| 0.8548611111111111 | 0 |
| 0.8555555555555556 | 0 |
| 0.8562500000000001 | 0 |
| 0.8569444444444444 | 0 |
| 0.8576388888888888 | 0 |
| 0.8583333333333334 | 0 |
| 0.8590277777777778 | 0 |
| 0.8597222222222222 | 0 |
| 0.8604166666666666 | 0 |
| 0.8611111111111112 | 0 |
| 0.8618055555555556 | 0 |
| 0.8624999999999999 | 0 |
| 0.8631944444444444 | 0 |
| 0.8638888888888889 | 0 |
| 0.8645833333333334 | 0 |
| 0.8652777777777777 | 0 |
| 0.8659722222222223 | 0 |
| 0.8666666666666667 | 0 |
| 0.8673611111111111 | 0 |
| 0.8680555555555555 | 0 |
| 0.86875 | 0 |
| 0.8694444444444445 | 0 |
| 0.8701388888888889 | 0 |
| 0.8708333333333332 | 0 |
| 0.8715277777777778 | 0 |
| 0.8722222222222222 | 0 |
| 0.8729166666666667 | 0 |
| 0.873611111111111 | 0 |
| 0.8743055555555556 | 0 |
| 0.875 | 0 |
| 0.8756944444444444 | 0 |
| 0.876388888888889 | 0 |
| 0.8770833333333333 | 0 |
| 0.8777777777777778 | 0 |
| 0.8784722222222222 | 0 |
| 0.8791666666666668 | 0 |
| 0.8798611111111111 | 0 |
| 0.8805555555555555 | 0 |
| 0.88125 | 0 |
| 0.8819444444444445 | 0 |
| 0.8826388888888889 | 0 |
| 0.8833333333333333 | 0 |
| 0.8840277777777777 | 0 |
| 0.8847222222222223 | 0 |
| 0.8854166666666666 | 0 |
| 0.8861111111111111 | 0 |
| 0.8868055555555556 | 0 |
| 0.8875000000000001 | 0 |
| 0.8881944444444444 | 0 |
| 0.8888888888888888 | 0 |
| 0.8895833333333334 | 0 |
| 0.8902777777777778 | 0 |
| 0.8909722222222222 | 0 |
| 0.8916666666666666 | 0 |
| 0.8923611111111112 | 0 |
| 0.8930555555555556 | 0 |
| 0.8937499999999999 | 0 |
| 0.8944444444444444 | 0 |
| 0.8951388888888889 | 0 |
| 0.8958333333333334 | 0 |
| 0.8965277777777777 | 0 |
| 0.8972222222222223 | 0 |
| 0.8979166666666667 | 0 |
| 0.8986111111111111 | 0 |
| 0.8993055555555555 | 0 |
| 0.9 | 0 |
| 0.9006944444444445 | 0 |
| 0.9013888888888889 | 0 |
| 0.9020833333333332 | 0 |
| 0.9027777777777778 | 0 |
| 0.9034722222222222 | 0 |
| 0.9041666666666667 | 0 |
| 0.904861111111111 | 0 |
| 0.9055555555555556 | 0 |
| 0.90625 | 0 |
| 0.9069444444444444 | 0 |
| 0.907638888888889 | 0 |
| 0.9083333333333333 | 0 |
| 0.9090277777777778 | 0 |
| 0.9097222222222222 | 0 |
| 0.9104166666666668 | 0 |
| 0.9111111111111111 | 0 |
| 0.9118055555555555 | 0 |
| 0.9125 | 0 |
| 0.9131944444444445 | 0 |
| 0.9138888888888889 | 0 |
| 0.9145833333333333 | 0 |
| 0.9152777777777777 | 0 |
| 0.9159722222222223 | 0 |
| 0.9166666666666666 | 0 |
| 0.9173611111111111 | 0 |
| 0.9180555555555556 | 0 |
| 0.9187500000000001 | 0 |
| 0.9194444444444444 | 0 |
| 0.9201388888888888 | 0 |
| 0.9208333333333334 | 0 |
| 0.9215277777777778 | 0 |
| 0.9222222222222222 | 0 |
| 0.9229166666666666 | 0 |
| 0.9236111111111112 | 0 |
| 0.9243055555555556 | 0 |
| 0.9249999999999999 | 0 |
| 0.9256944444444444 | 0 |
| 0.9263888888888889 | 0 |
| 0.9270833333333334 | 0 |
| 0.9277777777777777 | 0 |
| 0.9284722222222223 | 0 |
| 0.9291666666666667 | 0 |
| 0.9298611111111111 | 0 |
| 0.9305555555555555 | 0 |
| 0.93125 | 0 |
| 0.9319444444444445 | 0 |
| 0.9326388888888889 | 0 |
| 0.9333333333333332 | 0 |
| 0.9340277777777778 | 0 |
| 0.9347222222222222 | 0 |
| 0.9354166666666667 | 0 |
| 0.936111111111111 | 0 |
| 0.9368055555555556 | 0 |
| 0.9375 | 0 |
| 0.9381944444444444 | 0 |
| 0.938888888888889 | 0 |
| 0.9395833333333333 | 0 |
| 0.9402777777777778 | 0 |
| 0.9409722222222222 | 0 |
| 0.9416666666666668 | 0 |
| 0.9423611111111111 | 0 |
| 0.9430555555555555 | 0 |
| 0.94375 | 0 |
| 0.9444444444444445 | 0 |
| 0.9451388888888889 | 0 |
| 0.9458333333333333 | 0 |
| 0.9465277777777777 | 0 |
| 0.9472222222222223 | 0 |
| 0.9479166666666666 | 0 |
| 0.9486111111111111 | 0 |
| 0.9493055555555556 | 0 |
| 0.9500000000000001 | 0 |
| 0.9506944444444444 | 0 |
| 0.9513888888888888 | 0 |
| 0.9520833333333334 | 0 |
| 0.9527777777777778 | 0 |
| 0.9534722222222222 | 0 |
| 0.9541666666666666 | 0 |
| 0.9548611111111112 | 0 |
| 0.9555555555555556 | 0 |
| 0.9562499999999999 | 0 |
| 0.9569444444444444 | 0 |
| 0.9576388888888889 | 0 |
| 0.9583333333333334 | 0 |
| 0.9590277777777777 | 0 |
| 0.9597222222222223 | 0 |
| 0.9604166666666667 | 0 |
| 0.9611111111111111 | 0 |
| 0.9618055555555555 | 0 |
| 0.9625 | 0 |
| 0.9631944444444445 | 0 |
| 0.9638888888888889 | 0 |
| 0.9645833333333332 | 0 |
| 0.9652777777777778 | 0 |
| 0.9659722222222222 | 0 |
| 0.9666666666666667 | 0 |
| 0.967361111111111 | 0 |
| 0.9680555555555556 | 0 |
| 0.96875 | 0 |
| 0.9694444444444444 | 0 |
| 0.970138888888889 | 0 |
| 0.9708333333333333 | 0 |
| 0.9715277777777778 | 0 |
| 0.9722222222222222 | 0 |
| 0.9729166666666668 | 0 |
| 0.9736111111111111 | 0 |
| 0.9743055555555555 | 0 |
| 0.975 | 0 |
| 0.9756944444444445 | 0 |
| 0.9763888888888889 | 0 |
| 0.9770833333333333 | 0 |
| 0.9777777777777777 | 0 |
| 0.9784722222222223 | 0 |
| 0.9791666666666666 | 0 |
| 0.9798611111111111 | 0 |
| 0.9805555555555556 | 0 |
| 0.9812500000000001 | 0 |
| 0.9819444444444444 | 0 |
| 0.9826388888888888 | 0 |
| 0.9833333333333334 | 0 |
| 0.9840277777777778 | 0 |
| 0.9847222222222222 | 0 |
| 0.9854166666666666 | 0 |
| 0.9861111111111112 | 0 |
| 0.9868055555555556 | 0 |
| 0.9874999999999999 | 0 |
| 0.9881944444444444 | 0 |
| 0.9888888888888889 | 0 |
| 0.9895833333333334 | 0 |
| 0.9902777777777777 | 0 |
| 0.9909722222222223 | 0 |
| 0.9916666666666667 | 0 |
| 0.9923611111111111 | 0 |
| 0.9930555555555555 | 0 |
| 0.99375 | 0 |
| 0.9944444444444445 | 0 |
| 0.9951388888888889 | 0 |
| 0.9958333333333332 | 0 |
| 0.9965277777777778 | 0 |
| 0.9972222222222222 | 0 |
| 0.9979166666666667 | 0 |
| 0.998611111111111 | 0 |
| 0.9993055555555556 | 0 |